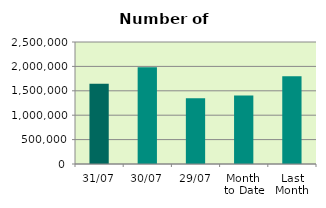
| Category | Series 0 |
|---|---|
| 31/07 | 1646042 |
| 30/07 | 1983212 |
| 29/07 | 1347430 |
| Month 
to Date | 1404253.739 |
| Last
Month | 1799892.818 |